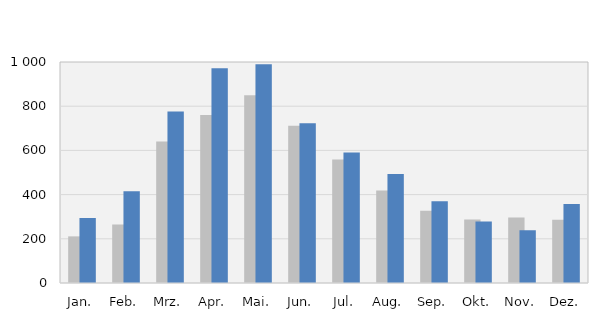
| Category | 2018 | 2019 |
|---|---|---|
| Jan. | 211 | 294 |
| Feb. | 265 | 415 |
| Mrz. | 640 | 776 |
| Apr. | 760 | 972 |
| Mai. | 850 | 990 |
| Jun. | 712 | 723 |
| Jul. | 559 | 590 |
| Aug. | 418 | 493 |
| Sep. | 327 | 370 |
| Okt. | 287 | 278 |
| Nov. | 296 | 239 |
| Dez. | 286 | 357 |